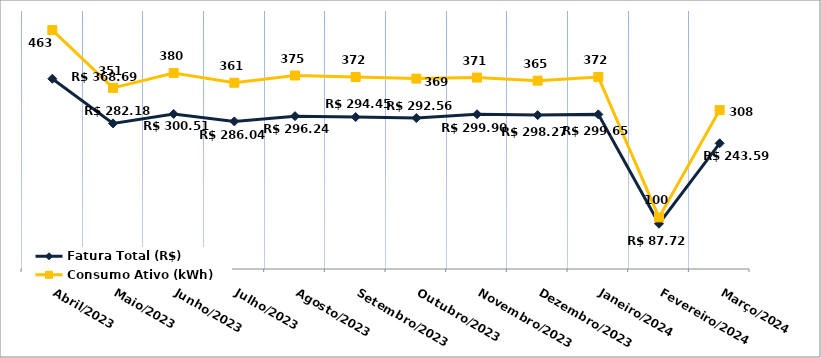
| Category | Fatura Total (R$) |
|---|---|
| Abril/2023 | 368.69 |
| Maio/2023 | 282.18 |
| Junho/2023 | 300.51 |
| Julho/2023 | 286.04 |
| Agosto/2023 | 296.24 |
| Setembro/2023 | 294.45 |
| Outubro/2023 | 292.56 |
| Novembro/2023 | 299.9 |
| Dezembro/2023 | 298.27 |
| Janeiro/2024 | 299.65 |
| Fevereiro/2024 | 87.72 |
| Março/2024 | 243.59 |